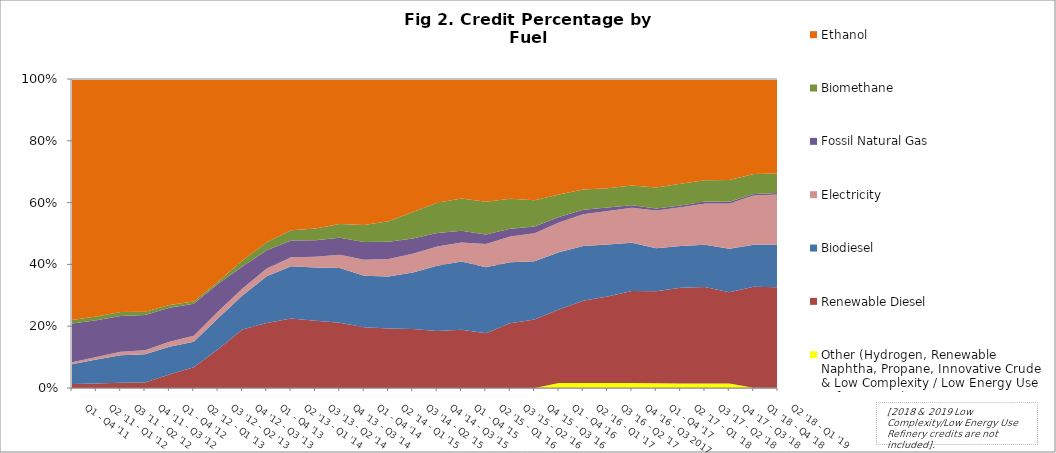
| Category | Other (Hydrogen, Renewable Naphtha, Propane, Innovative Crude & Low Complexity / Low Energy Use Refining, etc.) | Renewable Diesel | Biodiesel | Electricity | Fossil Natural Gas | Biomethane | Ethanol |
|---|---|---|---|---|---|---|---|
| Q1 - Q4 '11 | 0 | 4255 | 21066.75 | 1935.75 | 41097.5 | 3678.75 | 255888.25 |
| Q2 '11 - Q1 '12 | 0 | 5162.75 | 26837.25 | 2950.75 | 41170.5 | 4217.5 | 266727.25 |
| Q3 '11 - Q2 '12 | 0 | 6021.75 | 31928.25 | 4017.5 | 41417.75 | 4505.5 | 269743.5 |
| Q4 '11 - Q3 '12 | 0 | 6915.75 | 34835.25 | 5227.25 | 43542.5 | 4159.75 | 288811 |
| Q1 - Q4 '12 | 0 | 18164.75 | 37336.75 | 6746 | 45792.5 | 3711.25 | 304773.5 |
| Q2 '12 - Q1 '13 | 0 | 32600.75 | 40337.75 | 9379 | 50547.5 | 3679.5 | 351042.25 |
| Q3 '12 - Q2 '13 | 0 | 75473 | 60626 | 12868 | 54271 | 3919.25 | 394796.75 |
| Q4 '12 - Q3 '13 | 0 | 145738 | 84731.75 | 17304.25 | 54494 | 15303.75 | 451907.5 |
| Q1 - Q4 '13 | 0 | 197482.25 | 141667.5 | 23488.25 | 55487 | 24517.25 | 495969.5 |
| Q2 '13 - Q1 '14 | 0 | 229472.75 | 172125.5 | 30163.75 | 55101.5 | 33883.25 | 499193 |
| Q3 '13 - Q2 '14 | 0 | 237650.5 | 187184.5 | 38057.75 | 58197.25 | 42046.25 | 527117.75 |
| Q4 '13 - Q3 '14 | 0 | 230531.5 | 193299.25 | 46639.5 | 60710.25 | 47887.5 | 512500.5 |
| Q1 - Q4 '14 | 0 | 211244.75 | 179500 | 55332.5 | 61841.25 | 59811.5 | 507720.75 |
| Q2 '14 - Q1 '15 | 0 | 214231 | 186099.25 | 63321.25 | 62355 | 73382.5 | 511213.5 |
| Q3 '14 - Q2 '15 | 0 | 221521.75 | 212265.5 | 70066.25 | 57445.75 | 99866.25 | 499516 |
| Q4 '14 - Q3 '15 | 12.5 | 231039 | 264657.25 | 77983.75 | 54658.75 | 123058.75 | 502037.5 |
| Q1 - Q4 '15 | 18.5 | 259542.75 | 303477.5 | 84435 | 51526.5 | 143903.25 | 531188.5 |
| Q2 '15 - Q1 '16 | 26.75 | 277096.75 | 335225.5 | 117624 | 47534 | 166579.25 | 621973.75 |
| Q3 '15 - Q2 '16 | 33.75 | 384694.75 | 361311.75 | 152143.25 | 46525.5 | 178521.5 | 710130.25 |
| Q4 '15 - Q3 '16 | 21.5 | 454443.5 | 387917 | 185794.25 | 44372.25 | 175672.25 | 805438 |
| Q1 - Q4 '16 | 37958 | 560304.25 | 434195.75 | 226393.5 | 42687.5 | 170422.25 | 879776.75 |
| Q2 '16 - Q1 '17 | 38363.25 | 644325.25 | 430204 | 247688.75 | 35748 | 157929.5 | 866449 |
| Q3 '16 - Q2 '17 | 40188.25 | 685591.75 | 412601.75 | 267404 | 27637.75 | 153419.75 | 866394.5 |
| Q4 '16 - Q3 2017 | 40079.5 | 752235 | 393268 | 286840.25 | 20857.75 | 161286.75 | 869357.25 |
| Q1 - Q4 '17 | 37325 | 741682.5 | 345519.5 | 303525 | 14623.5 | 170246.25 | 872056 |
| Q2 '17 - Q1 '18 | 37867.5 | 794697.25 | 345443.75 | 321832.25 | 14438.75 | 180942.75 | 870380.25 |
| Q3 '17 - Q2 '18 | 38028.5 | 811822.25 | 354343.5 | 347213.25 | 15099 | 180192.25 | 850128.25 |
| Q4 '17 - Q3 '18 | 38043.75 | 771975.75 | 366448.5 | 382528 | 15326.75 | 183354.75 | 854713.25 |
| Q1 '18 - Q4 '18 | 2774.3 | 936026.8 | 390857.2 | 457623.6 | 13578.2 | 186705.2 | 881038.4 |
| Q2 '18 - Q1 '19 | 3427.75 | 964355.75 | 411987.25 | 480811 | 13149.75 | 188504.75 | 907214 |